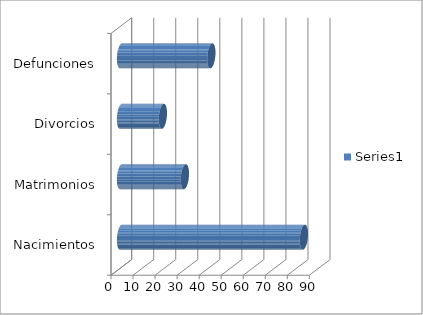
| Category | Series 0 |
|---|---|
| Nacimientos | 83 |
| Matrimonios | 29 |
| Divorcios | 19 |
| Defunciones | 41 |